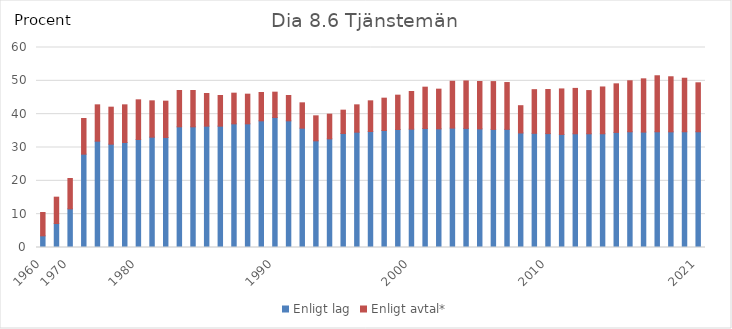
| Category | Enligt lag | Enligt avtal* |
|---|---|---|
| 1960 | 3.5 | 7 |
|  | 7.2 | 7.9 |
| 1970 | 11.6 | 9.1 |
|  | 28 | 10.7 |
|  | 31.9 | 10.9 |
|  | 31 | 11.1 |
|  | 31.5 | 11.3 |
| 1980 | 32.4 | 11.9 |
|  | 33.1 | 10.9 |
|  | 33 | 10.9 |
|  | 36.2 | 10.9 |
|  | 36.2 | 10.9 |
|  | 36.4 | 9.8 |
|  | 36.4 | 9.2 |
|  | 37.1 | 9.2 |
|  | 37.1 | 8.9 |
|  | 38 | 8.5 |
| 1990 | 39 | 7.6 |
|  | 38 | 7.6 |
|  | 35.8 | 7.6 |
|  | 32 | 7.5 |
|  | 32.6 | 7.4 |
|  | 34.2 | 7 |
|  | 34.6 | 8.2 |
|  | 34.8 | 9.2 |
|  | 35.1 | 9.7 |
|  | 35.4 | 10.3 |
| 2000 | 35.5 | 11.3 |
|  | 35.7 | 12.4 |
|  | 35.6 | 11.9 |
|  | 35.82 | 14.05 |
|  | 35.73 | 14.24 |
|  | 35.59 | 14.21 |
|  | 35.43 | 14.34 |
|  | 35.45 | 14.04 |
|  | 34.36 | 8.18 |
|  | 34.25 | 13.1 |
| 2010 | 34.17 | 13.23 |
|  | 33.92 | 13.65 |
|  | 34.12 | 13.61 |
|  | 34.12 | 12.96 |
|  | 34.12 | 14.04 |
|  | 34.52 | 14.58 |
|  | 34.72 | 15.3 |
|  | 34.62 | 15.98 |
|  | 34.72 | 16.8 |
|  | 34.7 | 16.52 |
|  | 34.72 | 16.06 |
| 2021 | 34.72 | 14.69 |